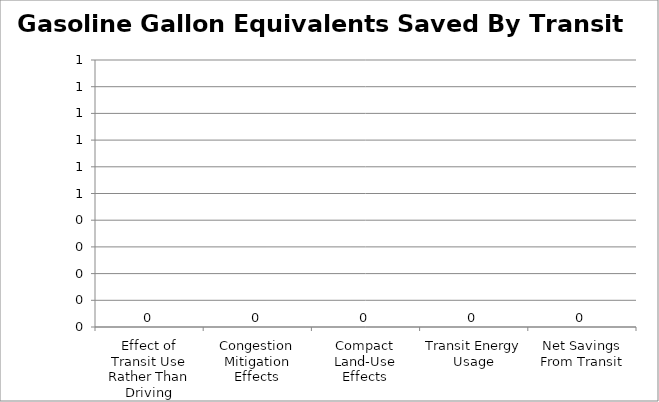
| Category | Gasoline Gallon Equivalents Saved by Transit |
|---|---|
| Effect of Transit Use Rather Than Driving | 0 |
| Congestion Mitigation Effects | 0 |
| Compact Land-Use Effects | 0 |
| Transit Energy Usage | 0 |
| Net Savings From Transit | 0 |